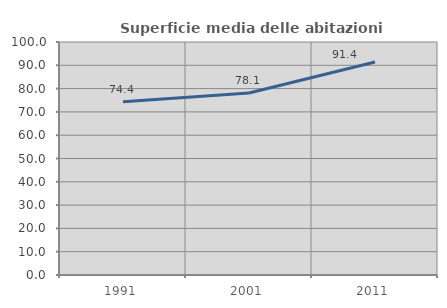
| Category | Superficie media delle abitazioni occupate |
|---|---|
| 1991.0 | 74.408 |
| 2001.0 | 78.13 |
| 2011.0 | 91.386 |